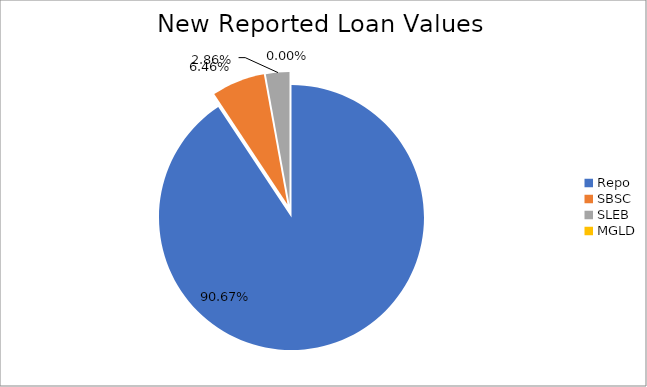
| Category | Series 0 |
|---|---|
| Repo | 12658484.973 |
| SBSC | 902426.997 |
| SLEB | 399028.381 |
| MGLD | 398.63 |